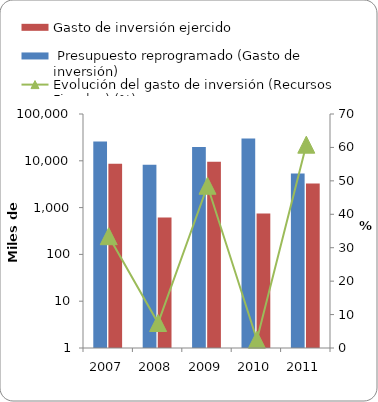
| Category |  Presupuesto reprogramado (Gasto de inversión) | Gasto de inversión ejercido |
|---|---|---|
| 2007 | 25921 | 8670 |
| 2008 | 8201 | 613 |
| 2009 | 19600 | 9514 |
| 2010 | 30109 | 748 |
| 2011 | 5365 | 3263 |